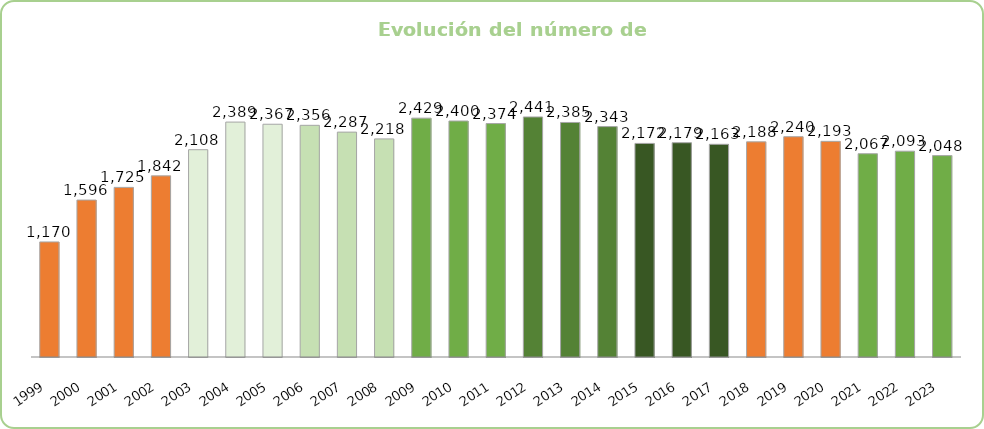
| Category | Series 0 |
|---|---|
| 1999.0 | 1170 |
| 2000.0 | 1596 |
| 2001.0 | 1725 |
| 2002.0 | 1842 |
| 2003.0 | 2108 |
| 2004.0 | 2389 |
| 2005.0 | 2367 |
| 2006.0 | 2356 |
| 2007.0 | 2287 |
| 2008.0 | 2218 |
| 2009.0 | 2429 |
| 2010.0 | 2400 |
| 2011.0 | 2374 |
| 2012.0 | 2441 |
| 2013.0 | 2385 |
| 2014.0 | 2343 |
| 2015.0 | 2172 |
| 2016.0 | 2179 |
| 2017.0 | 2163 |
| 2018.0 | 2188 |
| 2019.0 | 2240 |
| 2020.0 | 2193 |
| 2021.0 | 2067 |
| 2022.0 | 2093 |
| 2023.0 | 2048 |